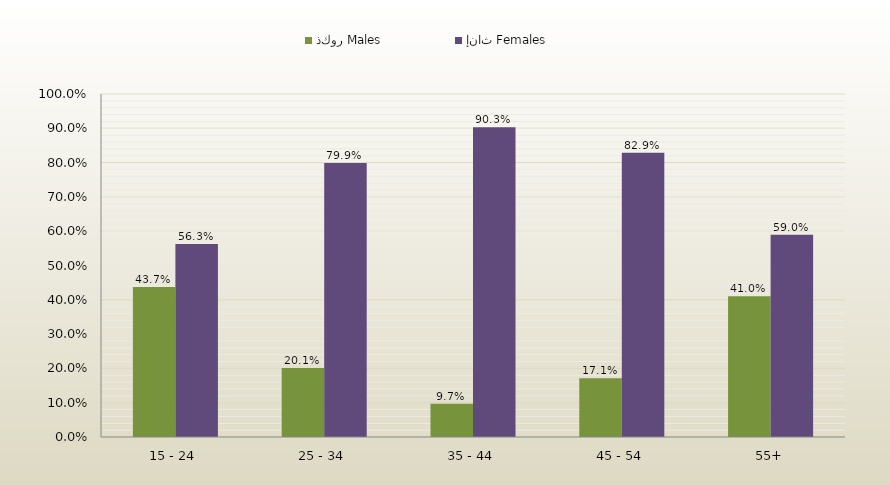
| Category | ذكور Males | إناث Females |
|---|---|---|
| 15 - 24 | 0.437 | 0.563 |
| 25 - 34 | 0.201 | 0.799 |
| 35 - 44 | 0.097 | 0.903 |
| 45 - 54 | 0.171 | 0.829 |
| 55+ | 0.41 | 0.59 |